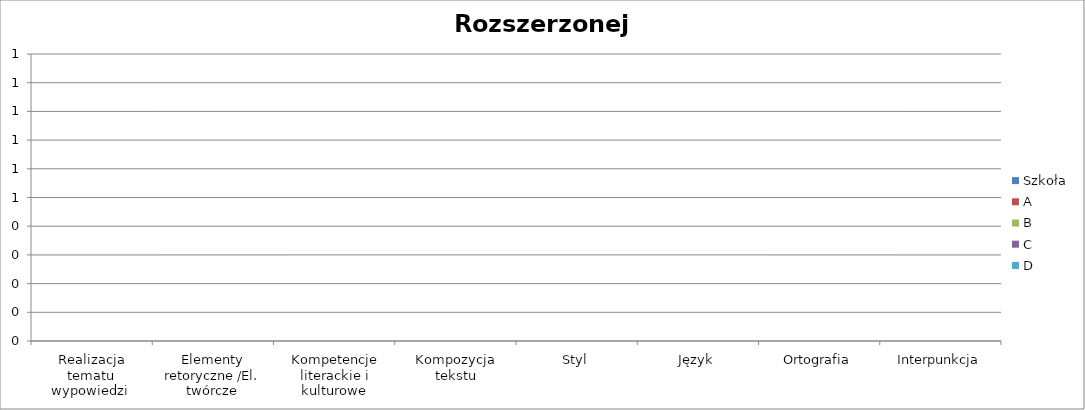
| Category | Szkoła | A | B | C | D |
|---|---|---|---|---|---|
| Realizacja tematu wypowiedzi  | 0 | 0 | 0 | 0 | 0 |
| Elementy retoryczne /El. twórcze | 0 | 0 | 0 | 0 | 0 |
| Kompetencje literackie i kulturowe | 0 | 0 | 0 | 0 | 0 |
| Kompozycja tekstu | 0 | 0 | 0 | 0 | 0 |
| Styl | 0 | 0 | 0 | 0 | 0 |
| Język | 0 | 0 | 0 | 0 | 0 |
| Ortografia | 0 | 0 | 0 | 0 | 0 |
| Interpunkcja | 0 | 0 | 0 | 0 | 0 |